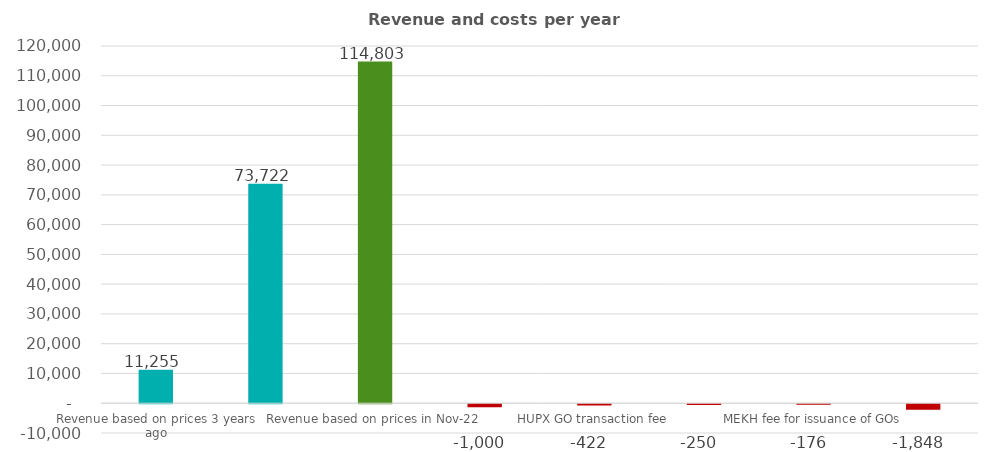
| Category | Series 0 |
|---|---|
| Revenue based on prices 3 years ago | 11255.2 |
| Revenue based on prices in Oct-22 | 73721.56 |
| Revenue based on prices in Nov-22 | 114803.04 |
| HUPX GO membeship fee | -1000 |
| HUPX GO transaction fee | -422.07 |
| MEKH account management fee | -250 |
| MEKH fee for issuance of GOs | -175.862 |
| Sum of fees | -1847.932 |